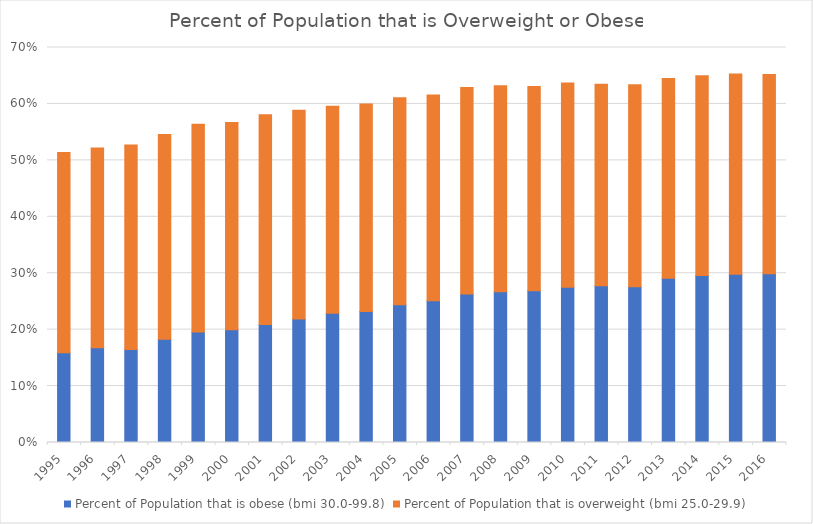
| Category | Percent of Population that is obese (bmi 30.0-99.8) | Percent of Population that is overweight (bmi 25.0-29.9) |
|---|---|---|
| 1995.0 | 0.159 | 0.355 |
| 1996.0 | 0.168 | 0.354 |
| 1997.0 | 0.165 | 0.362 |
| 1998.0 | 0.183 | 0.363 |
| 1999.0 | 0.196 | 0.368 |
| 2000.0 | 0.2 | 0.367 |
| 2001.0 | 0.209 | 0.372 |
| 2002.0 | 0.219 | 0.37 |
| 2003.0 | 0.229 | 0.367 |
| 2004.0 | 0.232 | 0.368 |
| 2005.0 | 0.244 | 0.367 |
| 2006.0 | 0.251 | 0.365 |
| 2007.0 | 0.263 | 0.366 |
| 2008.0 | 0.267 | 0.365 |
| 2009.0 | 0.269 | 0.362 |
| 2010.0 | 0.275 | 0.362 |
| 2011.0 | 0.278 | 0.357 |
| 2012.0 | 0.276 | 0.358 |
| 2013.0 | 0.291 | 0.354 |
| 2014.0 | 0.296 | 0.354 |
| 2015.0 | 0.298 | 0.355 |
| 2016.0 | 0.299 | 0.353 |